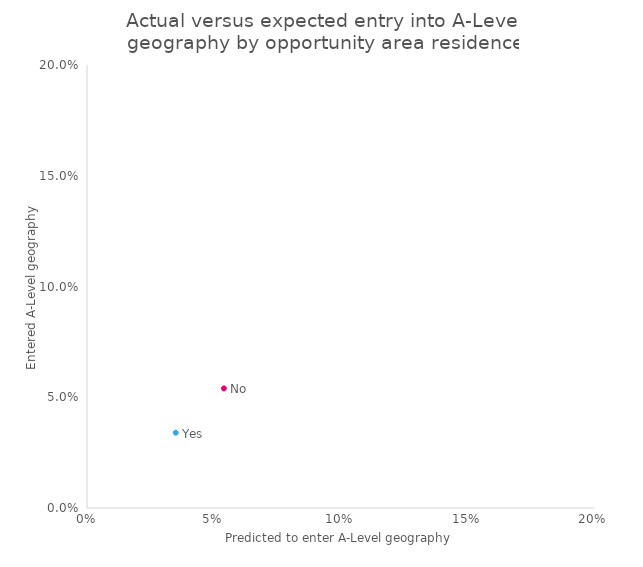
| Category | Series 0 |
|---|---|
| 0.054 | 0.054 |
| 0.035 | 0.034 |